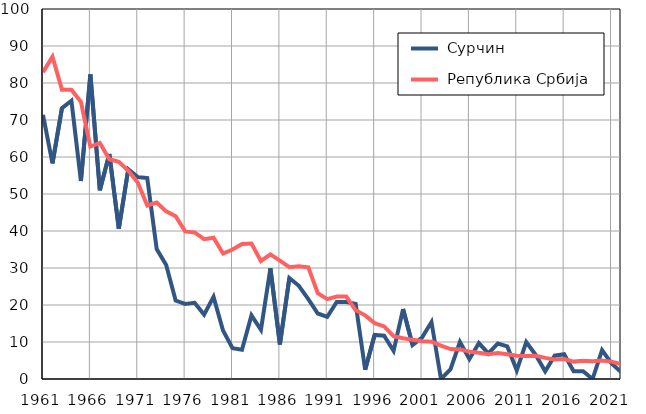
| Category |  Сурчин |  Република Србија |
|---|---|---|
| 1961.0 | 71.4 | 82.9 |
| 1962.0 | 58.3 | 87.1 |
| 1963.0 | 73.2 | 78.2 |
| 1964.0 | 75.2 | 78.2 |
| 1965.0 | 53.5 | 74.9 |
| 1966.0 | 82.3 | 62.8 |
| 1967.0 | 51 | 63.8 |
| 1968.0 | 60.8 | 59.4 |
| 1969.0 | 40.6 | 58.7 |
| 1970.0 | 56.7 | 56.3 |
| 1971.0 | 54.6 | 53.1 |
| 1972.0 | 54.3 | 46.9 |
| 1973.0 | 35.1 | 47.7 |
| 1974.0 | 30.8 | 45.3 |
| 1975.0 | 21.2 | 44 |
| 1976.0 | 20.3 | 39.9 |
| 1977.0 | 20.6 | 39.6 |
| 1978.0 | 17.4 | 37.8 |
| 1979.0 | 22.2 | 38.2 |
| 1980.0 | 13.1 | 33.9 |
| 1981.0 | 8.3 | 35 |
| 1982.0 | 7.9 | 36.5 |
| 1983.0 | 17.2 | 36.6 |
| 1984.0 | 13.3 | 31.9 |
| 1985.0 | 29.9 | 33.7 |
| 1986.0 | 9.3 | 32 |
| 1987.0 | 27.3 | 30.2 |
| 1988.0 | 25.2 | 30.5 |
| 1989.0 | 21.6 | 30.2 |
| 1990.0 | 17.7 | 23.2 |
| 1991.0 | 16.8 | 21.6 |
| 1992.0 | 20.8 | 22.3 |
| 1993.0 | 20.8 | 22.3 |
| 1994.0 | 20.3 | 18.6 |
| 1995.0 | 2.5 | 17.2 |
| 1996.0 | 11.9 | 15.1 |
| 1997.0 | 11.7 | 14.2 |
| 1998.0 | 7.6 | 11.6 |
| 1999.0 | 18.9 | 11 |
| 2000.0 | 9.2 | 10.6 |
| 2001.0 | 11.2 | 10.2 |
| 2002.0 | 15.4 | 10.1 |
| 2003.0 | 0 | 9 |
| 2004.0 | 2.6 | 8.1 |
| 2005.0 | 10 | 8 |
| 2006.0 | 5.4 | 7.4 |
| 2007.0 | 9.7 | 7.1 |
| 2008.0 | 6.9 | 6.7 |
| 2009.0 | 9.6 | 7 |
| 2010.0 | 8.8 | 6.7 |
| 2011.0 | 2.3 | 6.3 |
| 2012.0 | 10 | 6.2 |
| 2013.0 | 6.5 | 6.3 |
| 2014.0 | 2.1 | 5.7 |
| 2015.0 | 6.3 | 5.3 |
| 2016.0 | 6.7 | 5.4 |
| 2017.0 | 2.1 | 4.7 |
| 2018.0 | 2.1 | 4.9 |
| 2019.0 | 0 | 4.8 |
| 2020.0 | 7.8 | 5 |
| 2021.0 | 4.2 | 4.7 |
| 2022.0 | 1.9 | 4 |